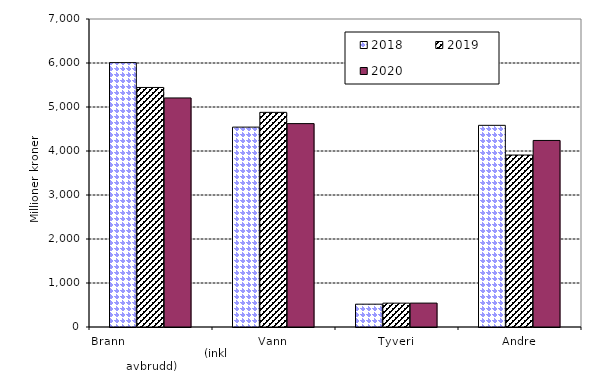
| Category | 2018 | 2019 | 2020 |
|---|---|---|---|
| Brann                                                       (inkl avbrudd) | 6008.519 | 5443.964 | 5205.622 |
| Vann | 4542.79 | 4878.204 | 4622.244 |
| Tyveri | 518.484 | 541.962 | 543.275 |
| Andre | 4583.442 | 3908.174 | 4239.75 |